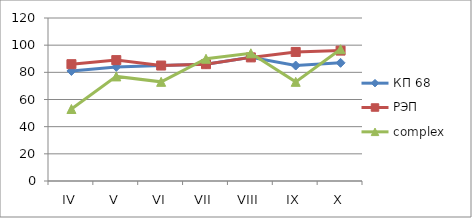
| Category | КП 68 | РЭП  | complex |
|---|---|---|---|
| IV | 81 | 86 | 53 |
| V | 84 | 89 | 77 |
| VI | 85 | 85 | 73 |
| VII | 86 | 86 | 90 |
| VIII | 91 | 91 | 94 |
| IX | 85 | 95 | 73 |
| X | 87 | 96 | 97 |